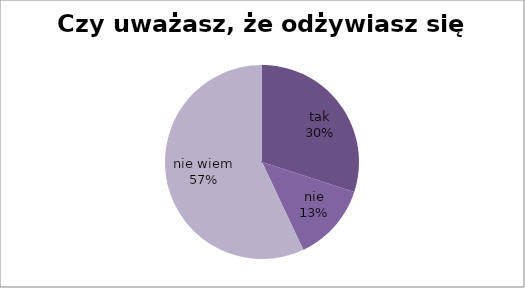
| Category | Czy uważasz, że odżywiasz się zdrowo? |
|---|---|
| tak | 30 |
| nie | 13 |
| nie wiem | 57 |